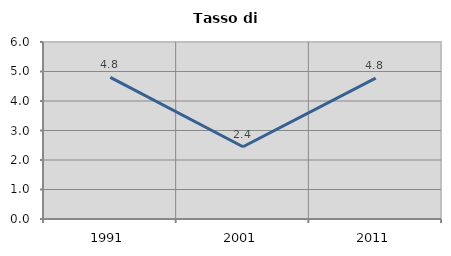
| Category | Tasso di disoccupazione   |
|---|---|
| 1991.0 | 4.8 |
| 2001.0 | 2.449 |
| 2011.0 | 4.777 |